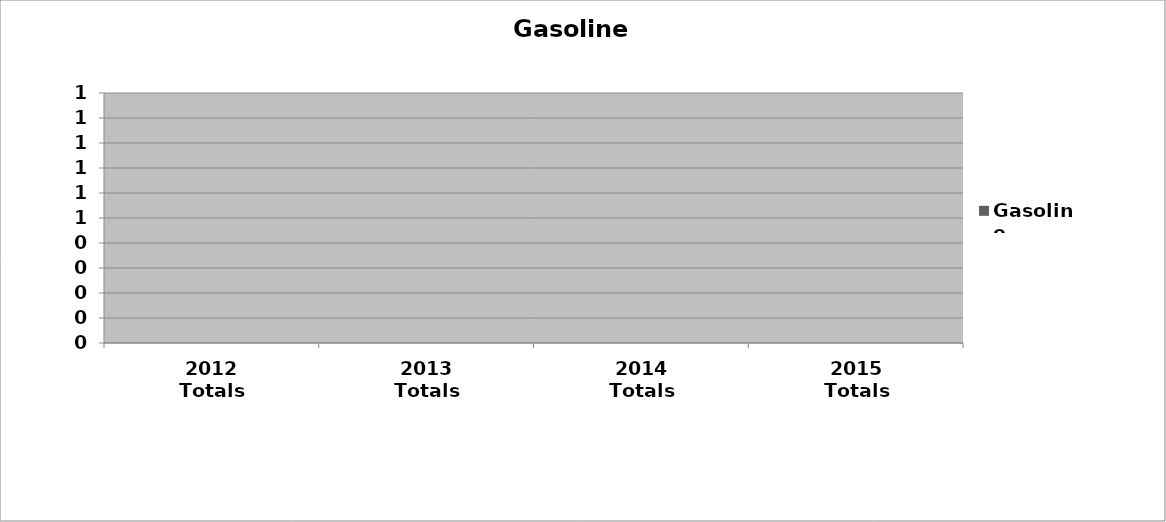
| Category | Gasoline |
|---|---|
| 2012 Totals | 0 |
| 2013 Totals | 0 |
| 2014 Totals | 0 |
| 2015 Totals | 0 |